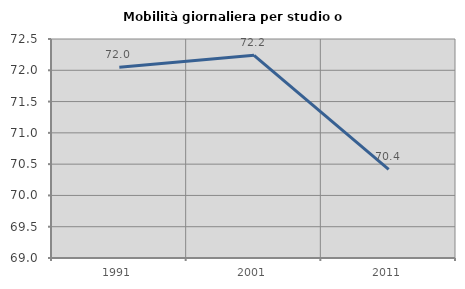
| Category | Mobilità giornaliera per studio o lavoro |
|---|---|
| 1991.0 | 72.048 |
| 2001.0 | 72.239 |
| 2011.0 | 70.417 |